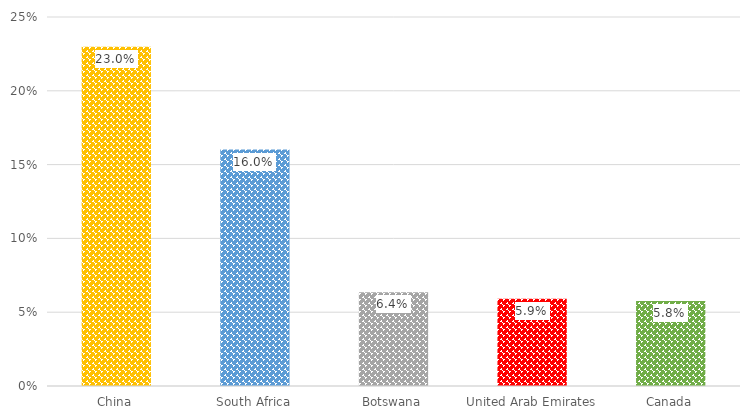
| Category | %Share |
|---|---|
| China | 0.23 |
| South Africa | 0.16 |
| Botswana | 0.064 |
| United Arab Emirates | 0.059 |
| Canada | 0.058 |